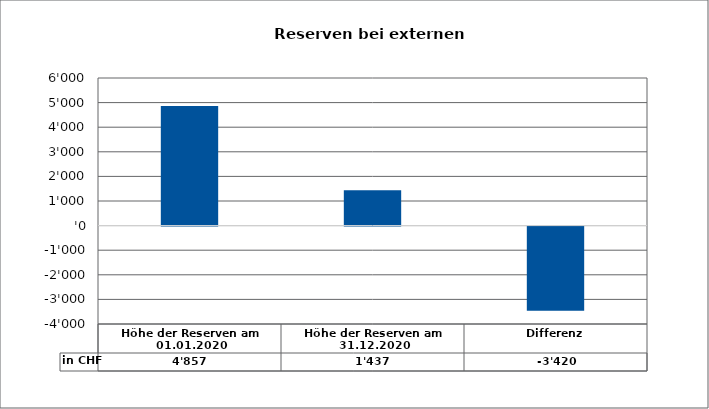
| Category | in CHF |
|---|---|
| Höhe der Reserven am 01.01.2020 | 4857 |
| Höhe der Reserven am 31.12.2020 | 1437.4 |
| Differenz | -3419.6 |